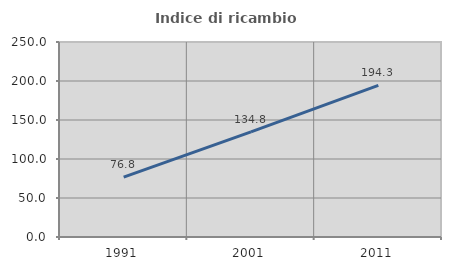
| Category | Indice di ricambio occupazionale  |
|---|---|
| 1991.0 | 76.768 |
| 2001.0 | 134.799 |
| 2011.0 | 194.314 |